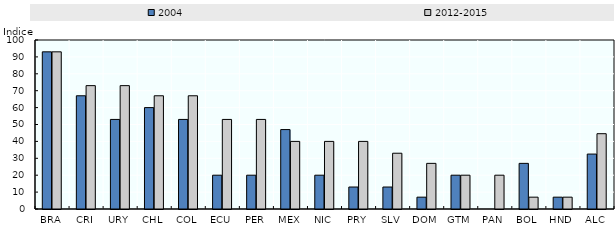
| Category | 2004 | 2012-2015 |
|---|---|---|
| BRA | 93 | 93 |
| CRI | 67 | 73 |
| URY | 53 | 73 |
| CHL | 60 | 67 |
| COL | 53 | 67 |
| ECU | 20 | 53 |
| PER | 20 | 53 |
| MEX | 47 | 40 |
| NIC | 20 | 40 |
| PRY | 13 | 40 |
| SLV | 13 | 33 |
| DOM | 7 | 27 |
| GTM | 20 | 20 |
| PAN | 0 | 20 |
| BOL | 27 | 7 |
| HND | 7 | 7 |
| ALC | 32.5 | 44.562 |